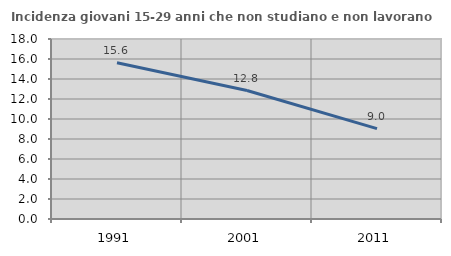
| Category | Incidenza giovani 15-29 anni che non studiano e non lavorano  |
|---|---|
| 1991.0 | 15.625 |
| 2001.0 | 12.849 |
| 2011.0 | 9.032 |